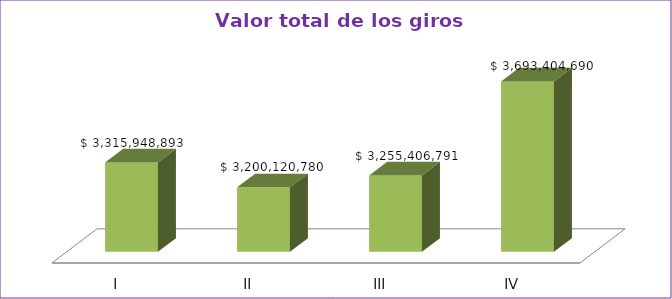
| Category | Series 0 |
|---|---|
| I | 3315948893 |
| II | 3200120780 |
| III | 3255406791 |
| IV | 3693404690 |